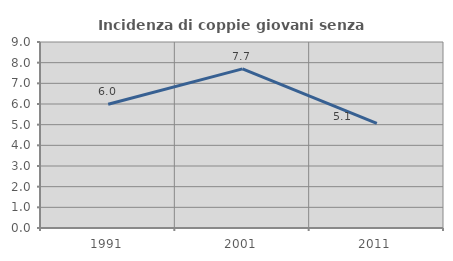
| Category | Incidenza di coppie giovani senza figli |
|---|---|
| 1991.0 | 5.986 |
| 2001.0 | 7.698 |
| 2011.0 | 5.067 |